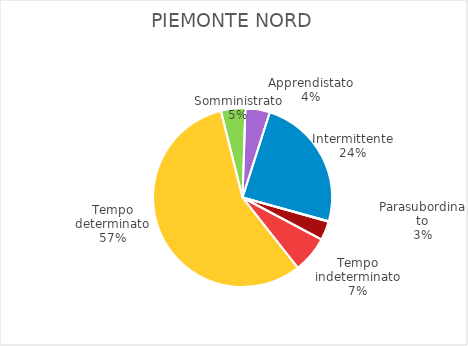
| Category | Piemonte Nord |
|---|---|
| Tempo indeterminato | 919 |
| Tempo determinato | 7896 |
| Somministrato | 615 |
| Apprendistato | 614 |
| Intermittente | 3387 |
| Domestico e a domicilio | 16 |
| Parasubordinato | 473 |